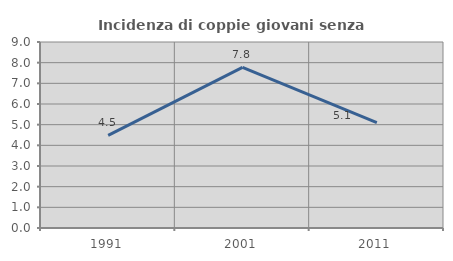
| Category | Incidenza di coppie giovani senza figli |
|---|---|
| 1991.0 | 4.483 |
| 2001.0 | 7.769 |
| 2011.0 | 5.1 |